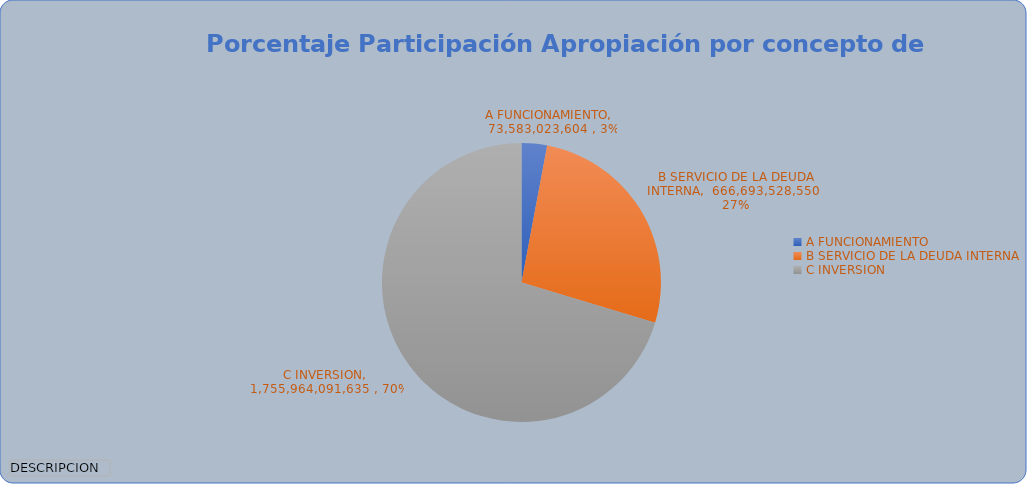
| Category | Total |
|---|---|
| A FUNCIONAMIENTO | 73583023604 |
| B SERVICIO DE LA DEUDA INTERNA | 666693528550 |
| C INVERSION | 1755964091635 |